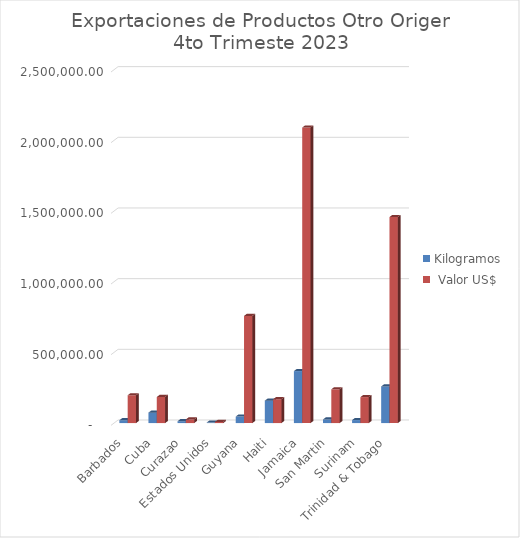
| Category | Kilogramos |  Valor US$ |
|---|---|---|
| Barbados | 20136 | 196641.86 |
| Cuba | 73742.81 | 184438.4 |
| Curazao | 13012.16 | 25555.45 |
| Estados Unidos | 3515.58 | 8036.82 |
| Guyana | 46156.8 | 758272.38 |
| Haiti | 158579.67 | 168789.6 |
| Jamaica | 367886.84 | 2090748.36 |
| San Martin | 25442.5 | 238812.45 |
| Surinam | 21279.36 | 183881.39 |
| Trinidad & Tobago | 259238.78 | 1457590.94 |